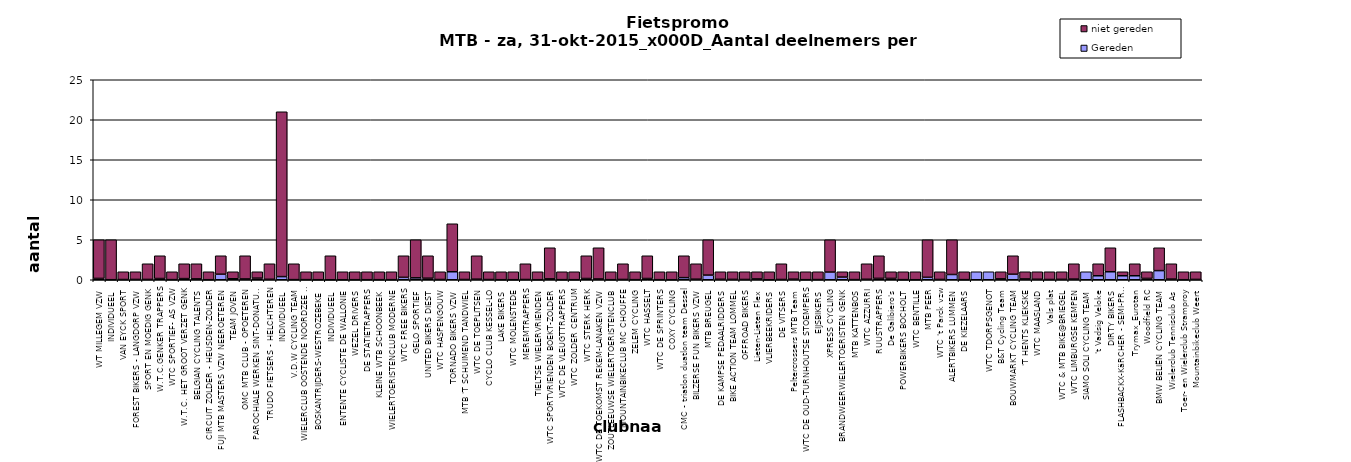
| Category | Gereden | niet gereden |
|---|---|---|
| WT MILLEGEM VZW | 0.166 | 4.834 |
| INDIVIDUEEL | 0.009 | 4.991 |
| VAN EYCK SPORT | 0.031 | 0.969 |
| FOREST BIKERS - LANGDORP VZW | 0.04 | 0.96 |
| SPORT EN MOEDIG GENK | 0.042 | 1.958 |
| W.T.C.GENKER TRAPPERS | 0.153 | 2.847 |
| WTC SPORTIEF- AS VZW | 0.019 | 0.981 |
| W.T.C. HET GROOT VERZET GENK | 0.143 | 1.857 |
| BELGIAN CYCLING TALENTS | 0.108 | 1.892 |
| CIRCUIT ZOLDER - HEUSDEN-ZOLDER | 0.006 | 0.994 |
| FUJI MTB MASTERS VZW NEEROETEREN | 0.692 | 2.308 |
| TEAM JOVEN | 0.125 | 0.875 |
| OMC MTB CLUB - OPOETEREN | 0.101 | 2.899 |
| PAROCHIALE WERKEN SINT-DONATUS DORNE-OPO | 0.2 | 0.8 |
| TRUDO FIETSERS - HELCHTEREN | 0.058 | 1.942 |
| INDIVIDUEEL | 0.394 | 20.606 |
| V.D.W CYCLING TEAM | 0.017 | 1.983 |
| WIELERCLUB OOSTENDE NOORDZEE - DESCHUYTT | 0.016 | 0.984 |
| BOSKANTRIJDERS-WESTROZEBEKE | 0.007 | 0.993 |
| INDIVIDUEEL | 0.002 | 2.998 |
| ENTENTE CYCLISTE DE WALLONIE | 0.002 | 0.998 |
| WEZEL DRIVERS | 0.008 | 0.992 |
| DE STATIETRAPPERS | 0.008 | 0.992 |
| KLEINE WTB SCHOONBEEK | 0.01 | 0.99 |
| WIELERTOERISTENCLUB MODERNE | 0.011 | 0.989 |
| WTC FREE BIKERS | 0.3 | 2.7 |
| GELO SPORTIEF | 0.238 | 4.762 |
| UNITED BIKERS DIEST | 0.191 | 2.809 |
| WTC HASPENGOUW | 0.032 | 0.968 |
| TORNADO BIKERS VZW | 1 | 6 |
| MTB 'T SCHUIMEND TANDWIEL | 0.034 | 0.966 |
| WTC DE TOEPLITSEN | 0.071 | 2.929 |
| CYCLO CLUB KESSEL-LO | 0.03 | 0.97 |
| LAKE BIKERS | 0.01 | 0.99 |
| WTC MOLENSTEDE | 0.01 | 0.99 |
| MEREMTRAPPERS | 0.033 | 1.967 |
| TIELTSE WIELERVRIENDEN | 0.009 | 0.991 |
| WTC SPORTVRIENDEN BOEKT-ZOLDER | 0.108 | 3.892 |
| WTC DE VLEUGTTRAPPERS | 0.012 | 0.988 |
| WTC ZOLDER CENTRUM | 0.009 | 0.991 |
| WTC STERK HERK | 0.155 | 2.845 |
| WTC DE TOEKOMST REKEM-LANAKEN VZW | 0.096 | 3.904 |
| ZOUTLEEUWSE WIELERTOERISTENCLUB | 0.011 | 0.989 |
| MOUNTAINBIKECLUB MC CHOUFFE | 0.038 | 1.962 |
| ZELEM CYCLING | 0.015 | 0.985 |
| WTC HASSELT | 0.155 | 2.845 |
| WTC DE SPRINTERS | 0.01 | 0.99 |
| COXY CYCLING | 0.005 | 0.995 |
| CMC - triatlon duatlon team Dessel | 0.265 | 2.735 |
| BILZERSE FUN BIKERS VZW | 0.07 | 1.93 |
| MTB BREUGEL | 0.581 | 4.419 |
| DE KAMPSE PEDAALRIDDERS | 0.059 | 0.941 |
| BIKE ACTION TEAM LOMMEL | 0.048 | 0.952 |
| OFFROAD BIKERS | 0.036 | 0.964 |
| Lieten-Lieten Flex | 0.1 | 0.9 |
| VLIERBEEKRIDERS | 0.002 | 0.998 |
| DE VITSERS | 0.034 | 1.966 |
| Peltercrossers MTB Team | 0.071 | 0.929 |
| WTC DE OUD-TURNHOUTSE STOEMPERS | 0.01 | 0.99 |
| EIJSBIKERS | 0.024 | 0.976 |
| XPRESS CYCLING | 0.962 | 4.038 |
| BRANDWEERWIELERTOERISTEN GENK | 0.333 | 0.667 |
| MTB KATTENBOS | 0.021 | 0.979 |
| WTC AZZURRI | 0.06 | 1.94 |
| RUUSTRAPPERS | 0.173 | 2.827 |
| De Galibiero's | 0.167 | 0.833 |
| POWERBIKERS BOCHOLT | 0.014 | 0.986 |
| WTC BENTILLE | 0.005 | 0.995 |
| MTB PEER | 0.305 | 4.695 |
| WTC 't Parck vzw | 0.038 | 0.962 |
| ALERTBIKERS LUMMEN | 0.658 | 4.342 |
| DE KIEZELAARS | 0.015 | 0.985 |
|  | 1 | 0 |
| WTC TDORPSGENOT | 1 | 0 |
| B&T Cycling Team | 0.111 | 0.889 |
| BOUWMARKT CYCLING TEAM | 0.692 | 2.308 |
| 'T HENTS KLIEKSKE | 0.1 | 0.9 |
| WTC MAASLAND | 0.062 | 0.938 |
| Vals plat | 0.033 | 0.967 |
| WTC & MTB BIKE@BRIEGEL | 0.053 | 0.947 |
| WTC LIMBURGSE KEMPEN | 0.082 | 1.918 |
| SIAMO SOLI CYCLING TEAM | 1 | 0 |
| 't Vadsig Veloke | 0.5 | 1.5 |
| DIRTY BIKERS | 1 | 3 |
| FLASHBACKX-KäRCHER - SEMI-PRO CYCLING TEAM | 0.5 | 0.5 |
| Trymax_Eurotan | 0.5 | 1.5 |
| Woodfield RC | 0.167 | 0.833 |
| BMW BELIËN CYCLING TEAM | 1.143 | 2.857 |
| Wielerclub Tennisclub As | 0.082 | 1.918 |
| Toer- en Wielerclub Stramproy | 0.008 | 0.992 |
| Mountainbikeclub Weert | 0.043 | 0.957 |